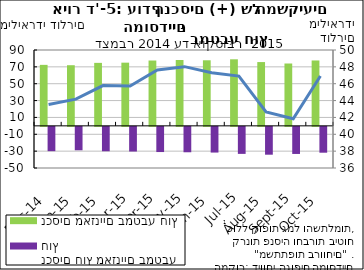
| Category | נכסים מאזניים במטבע חוץ | נכסים חוץ מאזניים במטבע חוץ |
|---|---|---|
| 2014-12-31 | 72.367 | -28.834 |
| 2015-01-31 | 71.953 | -27.78 |
| 2015-02-28 | 74.73 | -28.946 |
| 2015-03-31 | 74.985 | -29.267 |
| 2015-04-30 | 77.521 | -29.886 |
| 2015-05-31 | 78.171 | -30.148 |
| 2015-06-30 | 77.806 | -30.498 |
| 2015-07-31 | 78.968 | -32.062 |
| 2015-08-31 | 75.687 | -33.034 |
| 2015-09-30 | 73.979 | -32.144 |
| 2015-10-31 | 77.584 | -30.665 |